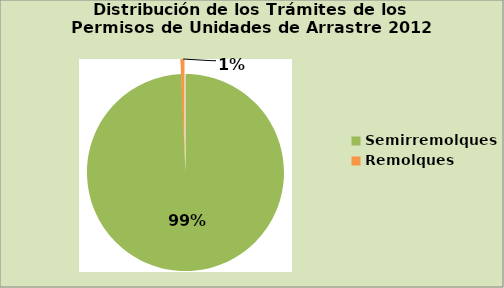
| Category | Series 0 |
|---|---|
| Semirremolques | 99.332 |
| Remolques | 0.668 |